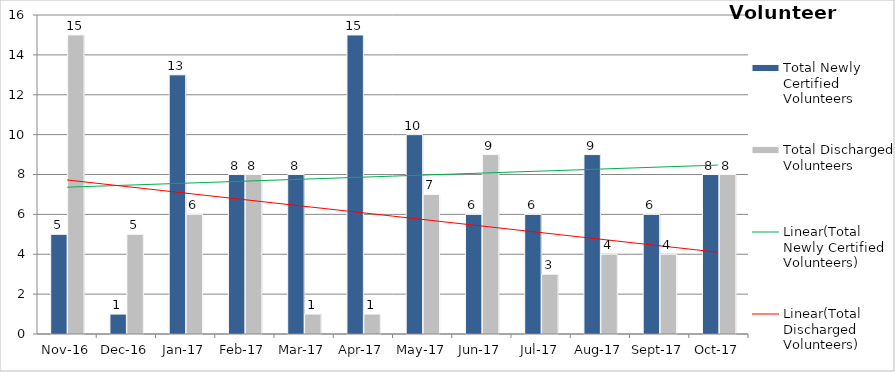
| Category | Total Newly Certified Volunteers | Total Discharged Volunteers |
|---|---|---|
| 2016-11-01 | 5 | 15 |
| 2016-12-01 | 1 | 5 |
| 2017-01-01 | 13 | 6 |
| 2017-02-01 | 8 | 8 |
| 2017-03-01 | 8 | 1 |
| 2017-04-01 | 15 | 1 |
| 2017-05-01 | 10 | 7 |
| 2017-06-01 | 6 | 9 |
| 2017-07-01 | 6 | 3 |
| 2017-08-01 | 9 | 4 |
| 2017-09-01 | 6 | 4 |
| 2017-10-01 | 8 | 8 |